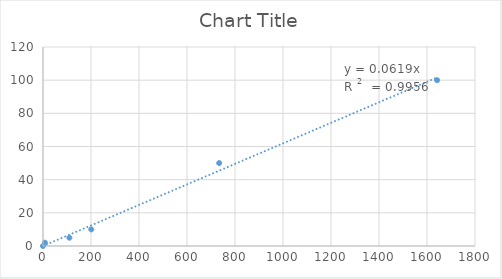
| Category | Series 0 |
|---|---|
| 0.0 | 0 |
| 8.0 | 2 |
| 110.0 | 5 |
| 201.0 | 10 |
| 734.0 | 50 |
| 1642.0 | 100 |